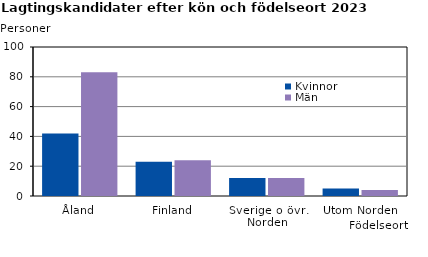
| Category | Kvinnor | Män |
|---|---|---|
| Åland | 42 | 83 |
| Finland | 23 | 24 |
| Sverige o övr. Norden | 12 | 12 |
| Utom Norden | 5 | 4 |